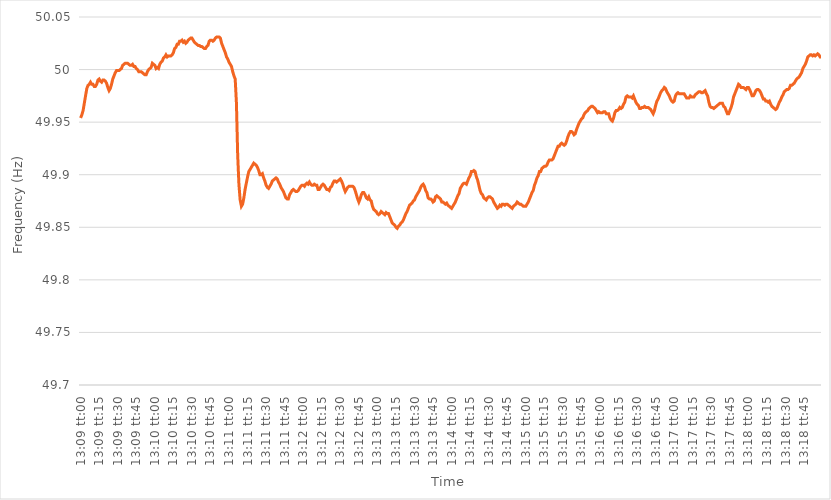
| Category | Series 0 |
|---|---|
| 0.5479166666666667 | 49.954 |
| 0.5479282407407408 | 49.957 |
| 0.5479398148148148 | 49.961 |
| 0.5479513888888888 | 49.968 |
| 0.547962962962963 | 49.975 |
| 0.547974537037037 | 49.982 |
| 0.5479861111111112 | 49.985 |
| 0.5479976851851852 | 49.986 |
| 0.5480092592592593 | 49.988 |
| 0.5480208333333333 | 49.986 |
| 0.5480324074074074 | 49.986 |
| 0.5480439814814815 | 49.984 |
| 0.5480555555555555 | 49.984 |
| 0.5480671296296297 | 49.986 |
| 0.5480787037037037 | 49.99 |
| 0.5480902777777777 | 49.991 |
| 0.5481018518518518 | 49.989 |
| 0.5481134259259259 | 49.988 |
| 0.548125 | 49.99 |
| 0.5481365740740741 | 49.99 |
| 0.5481481481481482 | 49.989 |
| 0.5481597222222222 | 49.987 |
| 0.5481712962962962 | 49.983 |
| 0.5481828703703704 | 49.98 |
| 0.5481944444444444 | 49.982 |
| 0.5482060185185186 | 49.986 |
| 0.5482175925925926 | 49.991 |
| 0.5482291666666667 | 49.994 |
| 0.5482407407407407 | 49.997 |
| 0.5482523148148148 | 49.999 |
| 0.5482638888888889 | 49.999 |
| 0.548275462962963 | 49.999 |
| 0.5482870370370371 | 50 |
| 0.5482986111111111 | 50.001 |
| 0.5483101851851852 | 50.004 |
| 0.5483217592592592 | 50.005 |
| 0.5483333333333333 | 50.006 |
| 0.5483449074074074 | 50.006 |
| 0.5483564814814815 | 50.006 |
| 0.5483680555555556 | 50.005 |
| 0.5483796296296296 | 50.004 |
| 0.5483912037037036 | 50.004 |
| 0.5484027777777778 | 50.005 |
| 0.5484143518518518 | 50.003 |
| 0.548425925925926 | 50.003 |
| 0.5484375 | 50.001 |
| 0.5484490740740741 | 50 |
| 0.5484606481481481 | 49.998 |
| 0.5484722222222222 | 49.998 |
| 0.5484837962962963 | 49.998 |
| 0.5484953703703704 | 49.997 |
| 0.5485069444444445 | 49.996 |
| 0.5485185185185185 | 49.995 |
| 0.5485300925925926 | 49.995 |
| 0.5485416666666666 | 49.998 |
| 0.5485532407407407 | 50 |
| 0.5485648148148148 | 50.001 |
| 0.5485763888888889 | 50.002 |
| 0.548587962962963 | 50.006 |
| 0.548599537037037 | 50.005 |
| 0.548611111111111 | 50.004 |
| 0.5486226851851852 | 50.001 |
| 0.5486342592592592 | 50.002 |
| 0.5486458333333334 | 50.001 |
| 0.5486574074074074 | 50.005 |
| 0.5486689814814815 | 50.007 |
| 0.5486805555555555 | 50.008 |
| 0.5486921296296297 | 50.011 |
| 0.5487037037037037 | 50.012 |
| 0.5487152777777778 | 50.014 |
| 0.5487268518518519 | 50.012 |
| 0.5487384259259259 | 50.013 |
| 0.54875 | 50.013 |
| 0.5487615740740741 | 50.013 |
| 0.5487731481481481 | 50.014 |
| 0.5487847222222222 | 50.016 |
| 0.5487962962962963 | 50.02 |
| 0.5488078703703704 | 50.021 |
| 0.5488194444444444 | 50.024 |
| 0.5488310185185185 | 50.024 |
| 0.5488425925925926 | 50.027 |
| 0.5488541666666666 | 50.027 |
| 0.5488657407407408 | 50.028 |
| 0.5488773148148148 | 50.026 |
| 0.5488888888888889 | 50.027 |
| 0.5489004629629629 | 50.025 |
| 0.5489120370370371 | 50.026 |
| 0.5489236111111111 | 50.028 |
| 0.5489351851851852 | 50.029 |
| 0.5489467592592593 | 50.03 |
| 0.5489583333333333 | 50.03 |
| 0.5489699074074074 | 50.028 |
| 0.5489814814814815 | 50.026 |
| 0.5489930555555556 | 50.025 |
| 0.5490046296296297 | 50.024 |
| 0.5490162037037037 | 50.023 |
| 0.5490277777777778 | 50.023 |
| 0.5490393518518518 | 50.022 |
| 0.5490509259259259 | 50.022 |
| 0.5490625 | 50.021 |
| 0.549074074074074 | 50.02 |
| 0.5490856481481482 | 50.02 |
| 0.5490972222222222 | 50.022 |
| 0.5491087962962963 | 50.023 |
| 0.5491203703703703 | 50.027 |
| 0.5491319444444445 | 50.028 |
| 0.5491435185185185 | 50.028 |
| 0.5491550925925927 | 50.027 |
| 0.5491666666666667 | 50.028 |
| 0.5491782407407407 | 50.03 |
| 0.5491898148148148 | 50.031 |
| 0.5492013888888889 | 50.031 |
| 0.549212962962963 | 50.031 |
| 0.5492245370370371 | 50.03 |
| 0.5492361111111111 | 50.025 |
| 0.5492476851851852 | 50.022 |
| 0.5492592592592592 | 50.019 |
| 0.5492708333333333 | 50.016 |
| 0.5492824074074074 | 50.012 |
| 0.5492939814814815 | 50.01 |
| 0.5493055555555556 | 50.007 |
| 0.5493171296296296 | 50.005 |
| 0.5493287037037037 | 50.003 |
| 0.5493402777777777 | 49.998 |
| 0.5493518518518519 | 49.994 |
| 0.5493634259259259 | 49.991 |
| 0.5493750000000001 | 49.968 |
| 0.5493865740740741 | 49.919 |
| 0.5493981481481481 | 49.891 |
| 0.5494097222222222 | 49.876 |
| 0.5494212962962963 | 49.87 |
| 0.5494328703703704 | 49.872 |
| 0.5494444444444445 | 49.878 |
| 0.5494560185185186 | 49.886 |
| 0.5494675925925926 | 49.892 |
| 0.5494791666666666 | 49.898 |
| 0.5494907407407407 | 49.903 |
| 0.5495023148148148 | 49.905 |
| 0.5495138888888889 | 49.907 |
| 0.549525462962963 | 49.909 |
| 0.549537037037037 | 49.911 |
| 0.5495486111111111 | 49.91 |
| 0.5495601851851851 | 49.909 |
| 0.5495717592592593 | 49.907 |
| 0.5495833333333333 | 49.904 |
| 0.5495949074074075 | 49.9 |
| 0.5496064814814815 | 49.9 |
| 0.5496180555555555 | 49.901 |
| 0.5496296296296296 | 49.897 |
| 0.5496412037037037 | 49.894 |
| 0.5496527777777778 | 49.89 |
| 0.5496643518518519 | 49.888 |
| 0.549675925925926 | 49.887 |
| 0.5496875 | 49.889 |
| 0.549699074074074 | 49.891 |
| 0.5497106481481482 | 49.894 |
| 0.5497222222222222 | 49.895 |
| 0.5497337962962963 | 49.896 |
| 0.5497453703703704 | 49.897 |
| 0.5497569444444445 | 49.896 |
| 0.5497685185185185 | 49.893 |
| 0.5497800925925925 | 49.891 |
| 0.5497916666666667 | 49.888 |
| 0.5498032407407407 | 49.886 |
| 0.5498148148148149 | 49.884 |
| 0.5498263888888889 | 49.881 |
| 0.549837962962963 | 49.878 |
| 0.549849537037037 | 49.877 |
| 0.5498611111111111 | 49.877 |
| 0.5498726851851852 | 49.881 |
| 0.5498842592592593 | 49.883 |
| 0.5498958333333334 | 49.885 |
| 0.5499074074074074 | 49.886 |
| 0.5499189814814814 | 49.885 |
| 0.5499305555555556 | 49.884 |
| 0.5499421296296296 | 49.884 |
| 0.5499537037037037 | 49.885 |
| 0.5499652777777778 | 49.887 |
| 0.5499768518518519 | 49.889 |
| 0.5499884259259259 | 49.89 |
| 0.5499999999999999 | 49.89 |
| 0.5500115740740741 | 49.889 |
| 0.5500231481481481 | 49.891 |
| 0.5500347222222223 | 49.892 |
| 0.5500462962962963 | 49.891 |
| 0.5500578703703703 | 49.893 |
| 0.5500694444444444 | 49.891 |
| 0.5500810185185185 | 49.89 |
| 0.5500925925925926 | 49.89 |
| 0.5501041666666667 | 49.891 |
| 0.5501157407407408 | 49.89 |
| 0.5501273148148148 | 49.89 |
| 0.5501388888888888 | 49.886 |
| 0.550150462962963 | 49.886 |
| 0.550162037037037 | 49.888 |
| 0.5501736111111112 | 49.89 |
| 0.5501851851851852 | 49.891 |
| 0.5501967592592593 | 49.89 |
| 0.5502083333333333 | 49.888 |
| 0.5502199074074073 | 49.886 |
| 0.5502314814814815 | 49.886 |
| 0.5502430555555555 | 49.885 |
| 0.5502546296296297 | 49.888 |
| 0.5502662037037037 | 49.889 |
| 0.5502777777777778 | 49.892 |
| 0.5502893518518518 | 49.894 |
| 0.5503009259259259 | 49.894 |
| 0.5503125 | 49.893 |
| 0.5503240740740741 | 49.894 |
| 0.5503356481481482 | 49.895 |
| 0.5503472222222222 | 49.896 |
| 0.5503587962962962 | 49.894 |
| 0.5503703703703704 | 49.891 |
| 0.5503819444444444 | 49.887 |
| 0.5503935185185186 | 49.884 |
| 0.5504050925925926 | 49.886 |
| 0.5504166666666667 | 49.888 |
| 0.5504282407407407 | 49.889 |
| 0.5504398148148147 | 49.889 |
| 0.5504513888888889 | 49.889 |
| 0.5504629629629629 | 49.889 |
| 0.5504745370370371 | 49.888 |
| 0.5504861111111111 | 49.885 |
| 0.5504976851851852 | 49.881 |
| 0.5505092592592592 | 49.877 |
| 0.5505208333333333 | 49.874 |
| 0.5505324074074074 | 49.877 |
| 0.5505439814814815 | 49.881 |
| 0.5505555555555556 | 49.883 |
| 0.5505671296296296 | 49.883 |
| 0.5505787037037037 | 49.881 |
| 0.5505902777777778 | 49.878 |
| 0.5506018518518518 | 49.877 |
| 0.550613425925926 | 49.879 |
| 0.550625 | 49.876 |
| 0.5506365740740741 | 49.875 |
| 0.5506481481481481 | 49.87 |
| 0.5506597222222221 | 49.867 |
| 0.5506712962962963 | 49.866 |
| 0.5506828703703703 | 49.865 |
| 0.5506944444444445 | 49.863 |
| 0.5507060185185185 | 49.862 |
| 0.5507175925925926 | 49.863 |
| 0.5507291666666666 | 49.865 |
| 0.5507407407407408 | 49.864 |
| 0.5507523148148148 | 49.863 |
| 0.5507638888888889 | 49.862 |
| 0.550775462962963 | 49.864 |
| 0.550787037037037 | 49.863 |
| 0.5507986111111111 | 49.863 |
| 0.5508101851851852 | 49.86 |
| 0.5508217592592592 | 49.857 |
| 0.5508333333333334 | 49.854 |
| 0.5508449074074074 | 49.853 |
| 0.5508564814814815 | 49.852 |
| 0.5508680555555555 | 49.85 |
| 0.5508796296296297 | 49.849 |
| 0.5508912037037037 | 49.851 |
| 0.5509027777777779 | 49.852 |
| 0.5509143518518519 | 49.854 |
| 0.5509259259259259 | 49.855 |
| 0.5509375 | 49.857 |
| 0.550949074074074 | 49.86 |
| 0.5509606481481482 | 49.863 |
| 0.5509722222222222 | 49.865 |
| 0.5509837962962963 | 49.868 |
| 0.5509953703703704 | 49.871 |
| 0.5510069444444444 | 49.872 |
| 0.5510185185185185 | 49.873 |
| 0.5510300925925926 | 49.875 |
| 0.5510416666666667 | 49.876 |
| 0.5510532407407408 | 49.879 |
| 0.5510648148148148 | 49.881 |
| 0.5510763888888889 | 49.883 |
| 0.5510879629629629 | 49.885 |
| 0.5510995370370371 | 49.888 |
| 0.5511111111111111 | 49.89 |
| 0.5511226851851853 | 49.891 |
| 0.5511342592592593 | 49.889 |
| 0.5511458333333333 | 49.885 |
| 0.5511574074074074 | 49.883 |
| 0.5511689814814814 | 49.878 |
| 0.5511805555555556 | 49.877 |
| 0.5511921296296296 | 49.877 |
| 0.5512037037037038 | 49.876 |
| 0.5512152777777778 | 49.874 |
| 0.5512268518518518 | 49.875 |
| 0.5512384259259259 | 49.879 |
| 0.55125 | 49.88 |
| 0.5512615740740741 | 49.879 |
| 0.5512731481481482 | 49.878 |
| 0.5512847222222222 | 49.877 |
| 0.5512962962962963 | 49.874 |
| 0.5513078703703703 | 49.874 |
| 0.5513194444444445 | 49.873 |
| 0.5513310185185185 | 49.872 |
| 0.5513425925925927 | 49.873 |
| 0.5513541666666667 | 49.871 |
| 0.5513657407407407 | 49.87 |
| 0.5513773148148148 | 49.869 |
| 0.5513888888888888 | 49.868 |
| 0.551400462962963 | 49.87 |
| 0.551412037037037 | 49.872 |
| 0.5514236111111112 | 49.874 |
| 0.5514351851851852 | 49.877 |
| 0.5514467592592592 | 49.88 |
| 0.5514583333333333 | 49.882 |
| 0.5514699074074074 | 49.887 |
| 0.5514814814814815 | 49.889 |
| 0.5514930555555556 | 49.891 |
| 0.5515046296296297 | 49.892 |
| 0.5515162037037037 | 49.892 |
| 0.5515277777777777 | 49.891 |
| 0.5515393518518519 | 49.894 |
| 0.5515509259259259 | 49.897 |
| 0.5515625000000001 | 49.899 |
| 0.5515740740740741 | 49.903 |
| 0.5515856481481481 | 49.903 |
| 0.5515972222222222 | 49.904 |
| 0.5516087962962963 | 49.903 |
| 0.5516203703703704 | 49.898 |
| 0.5516319444444444 | 49.895 |
| 0.5516435185185186 | 49.89 |
| 0.5516550925925926 | 49.885 |
| 0.5516666666666666 | 49.882 |
| 0.5516782407407407 | 49.881 |
| 0.5516898148148148 | 49.878 |
| 0.5517013888888889 | 49.877 |
| 0.551712962962963 | 49.876 |
| 0.551724537037037 | 49.878 |
| 0.5517361111111111 | 49.879 |
| 0.5517476851851851 | 49.879 |
| 0.5517592592592593 | 49.878 |
| 0.5517708333333333 | 49.877 |
| 0.5517824074074075 | 49.874 |
| 0.5517939814814815 | 49.872 |
| 0.5518055555555555 | 49.87 |
| 0.5518171296296296 | 49.868 |
| 0.5518287037037037 | 49.869 |
| 0.5518402777777778 | 49.871 |
| 0.5518518518518518 | 49.87 |
| 0.551863425925926 | 49.872 |
| 0.551875 | 49.872 |
| 0.551886574074074 | 49.871 |
| 0.5518981481481481 | 49.872 |
| 0.5519097222222222 | 49.872 |
| 0.5519212962962963 | 49.871 |
| 0.5519328703703704 | 49.87 |
| 0.5519444444444445 | 49.869 |
| 0.5519560185185185 | 49.868 |
| 0.5519675925925925 | 49.87 |
| 0.5519791666666667 | 49.871 |
| 0.5519907407407407 | 49.872 |
| 0.5520023148148149 | 49.874 |
| 0.5520138888888889 | 49.873 |
| 0.552025462962963 | 49.872 |
| 0.552037037037037 | 49.872 |
| 0.5520486111111111 | 49.871 |
| 0.5520601851851852 | 49.87 |
| 0.5520717592592593 | 49.87 |
| 0.5520833333333334 | 49.87 |
| 0.5520949074074074 | 49.872 |
| 0.5521064814814814 | 49.874 |
| 0.5521180555555555 | 49.877 |
| 0.5521296296296296 | 49.88 |
| 0.5521412037037037 | 49.883 |
| 0.5521527777777778 | 49.885 |
| 0.5521643518518519 | 49.89 |
| 0.5521759259259259 | 49.893 |
| 0.5521874999999999 | 49.897 |
| 0.5521990740740741 | 49.899 |
| 0.5522106481481481 | 49.903 |
| 0.5522222222222223 | 49.903 |
| 0.5522337962962963 | 49.906 |
| 0.5522453703703704 | 49.907 |
| 0.5522569444444444 | 49.908 |
| 0.5522685185185185 | 49.908 |
| 0.5522800925925926 | 49.909 |
| 0.5522916666666667 | 49.912 |
| 0.5523032407407408 | 49.914 |
| 0.5523148148148148 | 49.914 |
| 0.5523263888888889 | 49.914 |
| 0.5523379629629629 | 49.915 |
| 0.552349537037037 | 49.918 |
| 0.5523611111111111 | 49.921 |
| 0.5523726851851852 | 49.924 |
| 0.5523842592592593 | 49.927 |
| 0.5523958333333333 | 49.927 |
| 0.5524074074074073 | 49.929 |
| 0.5524189814814815 | 49.93 |
| 0.5524305555555555 | 49.929 |
| 0.5524421296296297 | 49.928 |
| 0.5524537037037037 | 49.929 |
| 0.5524652777777778 | 49.932 |
| 0.5524768518518518 | 49.936 |
| 0.552488425925926 | 49.939 |
| 0.5525 | 49.941 |
| 0.5525115740740741 | 49.941 |
| 0.5525231481481482 | 49.94 |
| 0.5525347222222222 | 49.938 |
| 0.5525462962962963 | 49.939 |
| 0.5525578703703703 | 49.943 |
| 0.5525694444444444 | 49.946 |
| 0.5525810185185185 | 49.949 |
| 0.5525925925925926 | 49.951 |
| 0.5526041666666667 | 49.953 |
| 0.5526157407407407 | 49.954 |
| 0.5526273148148148 | 49.957 |
| 0.5526388888888889 | 49.959 |
| 0.5526504629629629 | 49.96 |
| 0.5526620370370371 | 49.961 |
| 0.5526736111111111 | 49.963 |
| 0.5526851851851852 | 49.964 |
| 0.5526967592592592 | 49.965 |
| 0.5527083333333334 | 49.965 |
| 0.5527199074074074 | 49.964 |
| 0.5527314814814815 | 49.963 |
| 0.5527430555555556 | 49.961 |
| 0.5527546296296296 | 49.959 |
| 0.5527662037037037 | 49.96 |
| 0.5527777777777778 | 49.959 |
| 0.5527893518518519 | 49.959 |
| 0.552800925925926 | 49.959 |
| 0.5528125 | 49.96 |
| 0.5528240740740741 | 49.96 |
| 0.5528356481481481 | 49.958 |
| 0.5528472222222222 | 49.958 |
| 0.5528587962962963 | 49.958 |
| 0.5528703703703703 | 49.954 |
| 0.5528819444444445 | 49.952 |
| 0.5528935185185185 | 49.951 |
| 0.5529050925925926 | 49.954 |
| 0.5529166666666666 | 49.959 |
| 0.5529282407407408 | 49.961 |
| 0.5529398148148148 | 49.961 |
| 0.552951388888889 | 49.962 |
| 0.552962962962963 | 49.964 |
| 0.552974537037037 | 49.963 |
| 0.5529861111111111 | 49.964 |
| 0.5529976851851852 | 49.967 |
| 0.5530092592592593 | 49.969 |
| 0.5530208333333334 | 49.974 |
| 0.5530324074074074 | 49.975 |
| 0.5530439814814815 | 49.974 |
| 0.5530555555555555 | 49.974 |
| 0.5530671296296296 | 49.974 |
| 0.5530787037037037 | 49.973 |
| 0.5530902777777778 | 49.975 |
| 0.5531018518518519 | 49.972 |
| 0.5531134259259259 | 49.969 |
| 0.553125 | 49.967 |
| 0.553136574074074 | 49.966 |
| 0.5531481481481482 | 49.963 |
| 0.5531597222222222 | 49.963 |
| 0.5531712962962964 | 49.964 |
| 0.5531828703703704 | 49.964 |
| 0.5531944444444444 | 49.965 |
| 0.5532060185185185 | 49.964 |
| 0.5532175925925926 | 49.964 |
| 0.5532291666666667 | 49.964 |
| 0.5532407407407408 | 49.963 |
| 0.5532523148148148 | 49.962 |
| 0.5532638888888889 | 49.96 |
| 0.5532754629629629 | 49.958 |
| 0.553287037037037 | 49.961 |
| 0.5532986111111111 | 49.966 |
| 0.5533101851851852 | 49.97 |
| 0.5533217592592593 | 49.972 |
| 0.5533333333333333 | 49.975 |
| 0.5533449074074074 | 49.978 |
| 0.5533564814814814 | 49.98 |
| 0.5533680555555556 | 49.981 |
| 0.5533796296296296 | 49.983 |
| 0.5533912037037038 | 49.982 |
| 0.5534027777777778 | 49.979 |
| 0.5534143518518518 | 49.977 |
| 0.5534259259259259 | 49.975 |
| 0.5534375 | 49.972 |
| 0.5534490740740741 | 49.97 |
| 0.5534606481481482 | 49.969 |
| 0.5534722222222223 | 49.97 |
| 0.5534837962962963 | 49.975 |
| 0.5534953703703703 | 49.977 |
| 0.5535069444444445 | 49.978 |
| 0.5535185185185185 | 49.977 |
| 0.5535300925925926 | 49.977 |
| 0.5535416666666667 | 49.977 |
| 0.5535532407407407 | 49.977 |
| 0.5535648148148148 | 49.977 |
| 0.5535763888888888 | 49.975 |
| 0.553587962962963 | 49.973 |
| 0.553599537037037 | 49.973 |
| 0.5536111111111112 | 49.973 |
| 0.5536226851851852 | 49.975 |
| 0.5536342592592592 | 49.974 |
| 0.5536458333333333 | 49.974 |
| 0.5536574074074074 | 49.974 |
| 0.5536689814814815 | 49.976 |
| 0.5536805555555556 | 49.977 |
| 0.5536921296296297 | 49.978 |
| 0.5537037037037037 | 49.979 |
| 0.5537152777777777 | 49.979 |
| 0.5537268518518519 | 49.978 |
| 0.5537384259259259 | 49.978 |
| 0.55375 | 49.979 |
| 0.5537615740740741 | 49.98 |
| 0.5537731481481482 | 49.977 |
| 0.5537847222222222 | 49.975 |
| 0.5537962962962962 | 49.969 |
| 0.5538078703703704 | 49.965 |
| 0.5538194444444444 | 49.964 |
| 0.5538310185185186 | 49.964 |
| 0.5538425925925926 | 49.963 |
| 0.5538541666666666 | 49.964 |
| 0.5538657407407407 | 49.965 |
| 0.5538773148148148 | 49.966 |
| 0.5538888888888889 | 49.967 |
| 0.553900462962963 | 49.968 |
| 0.5539120370370371 | 49.968 |
| 0.5539236111111111 | 49.968 |
| 0.5539351851851851 | 49.965 |
| 0.5539467592592593 | 49.964 |
| 0.5539583333333333 | 49.961 |
| 0.5539699074074074 | 49.958 |
| 0.5539814814814815 | 49.958 |
| 0.5539930555555556 | 49.961 |
| 0.5540046296296296 | 49.964 |
| 0.5540162037037036 | 49.968 |
| 0.5540277777777778 | 49.974 |
| 0.5540393518518518 | 49.977 |
| 0.554050925925926 | 49.98 |
| 0.5540625 | 49.983 |
| 0.554074074074074 | 49.986 |
| 0.5540856481481481 | 49.985 |
| 0.5540972222222222 | 49.983 |
| 0.5541087962962963 | 49.983 |
| 0.5541203703703704 | 49.983 |
| 0.5541319444444445 | 49.982 |
| 0.5541435185185185 | 49.981 |
| 0.5541550925925925 | 49.983 |
| 0.5541666666666667 | 49.983 |
| 0.5541782407407407 | 49.981 |
| 0.5541898148148149 | 49.978 |
| 0.5542013888888889 | 49.975 |
| 0.554212962962963 | 49.975 |
| 0.554224537037037 | 49.977 |
| 0.554236111111111 | 49.98 |
| 0.5542476851851852 | 49.981 |
| 0.5542592592592592 | 49.981 |
| 0.5542708333333334 | 49.98 |
| 0.5542824074074074 | 49.978 |
| 0.5542939814814815 | 49.975 |
| 0.5543055555555555 | 49.972 |
| 0.5543171296296296 | 49.972 |
| 0.5543287037037037 | 49.97 |
| 0.5543402777777778 | 49.97 |
| 0.5543518518518519 | 49.969 |
| 0.5543634259259259 | 49.97 |
| 0.554375 | 49.967 |
| 0.5543865740740741 | 49.965 |
| 0.5543981481481481 | 49.964 |
| 0.5544097222222223 | 49.963 |
| 0.5544212962962963 | 49.962 |
| 0.5544328703703704 | 49.963 |
| 0.5544444444444444 | 49.966 |
| 0.5544560185185184 | 49.969 |
| 0.5544675925925926 | 49.971 |
| 0.5544791666666666 | 49.974 |
| 0.5544907407407408 | 49.976 |
| 0.5545023148148148 | 49.979 |
| 0.5545138888888889 | 49.98 |
| 0.5545254629629629 | 49.981 |
| 0.554537037037037 | 49.981 |
| 0.5545486111111111 | 49.982 |
| 0.5545601851851852 | 49.985 |
| 0.5545717592592593 | 49.985 |
| 0.5545833333333333 | 49.986 |
| 0.5545949074074074 | 49.987 |
| 0.5546064814814815 | 49.989 |
| 0.5546180555555555 | 49.991 |
| 0.5546296296296297 | 49.992 |
| 0.5546412037037037 | 49.993 |
| 0.5546527777777778 | 49.995 |
| 0.5546643518518518 | 49.997 |
| 0.554675925925926 | 50.001 |
| 0.5546875 | 50.003 |
| 0.554699074074074 | 50.005 |
| 0.5547106481481482 | 50.008 |
| 0.5547222222222222 | 50.012 |
| 0.5547337962962963 | 50.013 |
| 0.5547453703703703 | 50.014 |
| 0.5547569444444445 | 50.014 |
| 0.5547685185185185 | 50.013 |
| 0.5547800925925926 | 50.014 |
| 0.5547916666666667 | 50.013 |
| 0.5548032407407407 | 50.014 |
| 0.5548148148148148 | 50.015 |
| 0.5548263888888889 | 50.014 |
| 0.554837962962963 | 50.012 |
| 0.5548495370370371 | 50.012 |